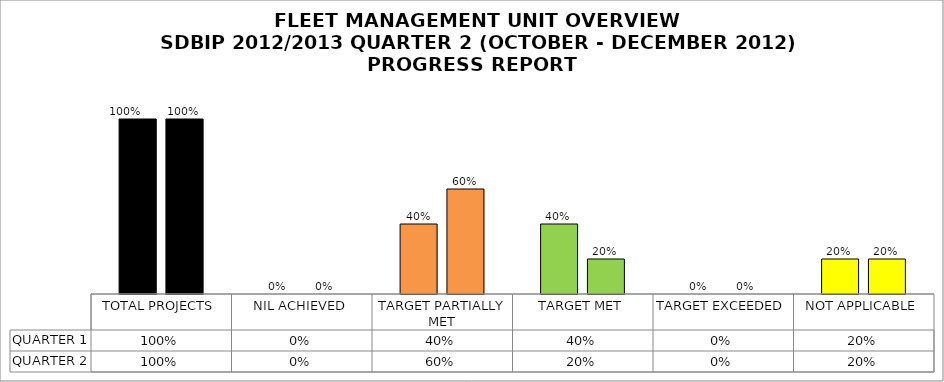
| Category | QUARTER 1 | QUARTER 2 |
|---|---|---|
| TOTAL PROJECTS | 1 | 1 |
| NIL ACHIEVED | 0 | 0 |
| TARGET PARTIALLY MET | 0.4 | 0.6 |
| TARGET MET | 0.4 | 0.2 |
| TARGET EXCEEDED | 0 | 0 |
| NOT APPLICABLE | 0.2 | 0.2 |